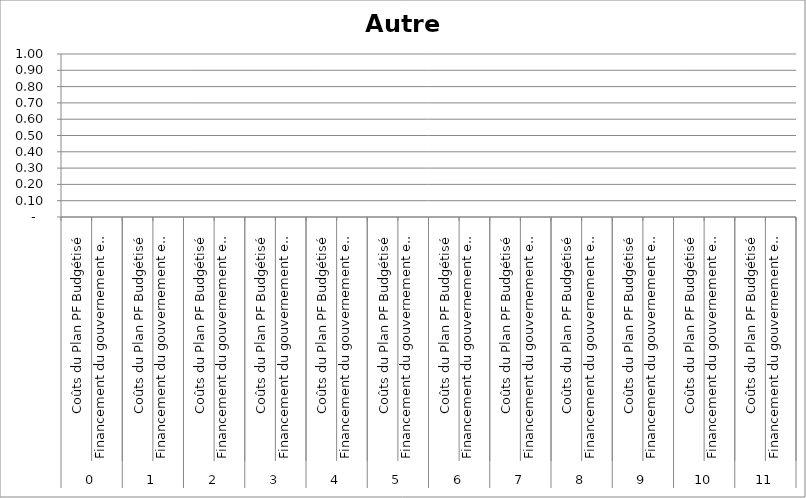
| Category | Autre 2 |
|---|---|
| 0 | 0 |
| 1 | 0 |
| 2 | 0 |
| 3 | 0 |
| 4 | 0 |
| 5 | 0 |
| 6 | 0 |
| 7 | 0 |
| 8 | 0 |
| 9 | 0 |
| 10 | 0 |
| 11 | 0 |
| 12 | 0 |
| 13 | 0 |
| 14 | 0 |
| 15 | 0 |
| 16 | 0 |
| 17 | 0 |
| 18 | 0 |
| 19 | 0 |
| 20 | 0 |
| 21 | 0 |
| 22 | 0 |
| 23 | 0 |